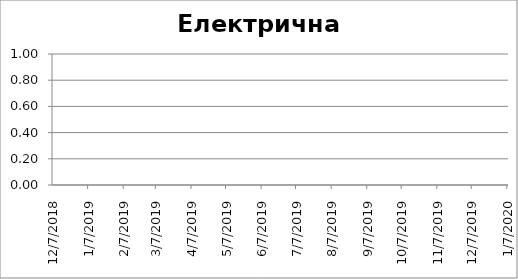
| Category | Електрична енергія |
|---|---|
| 12/7/18 | 0 |
| 12/13/18 | 0 |
| 12/19/18 | 0 |
| 12/25/18 | 0 |
| 12/31/18 | 0 |
| 1/6/19 | 0 |
| 1/12/19 | 0 |
| 1/18/19 | 0 |
| 1/24/19 | 0 |
| 1/30/19 | 0 |
| 2/5/19 | 0 |
| 2/11/19 | 0 |
| 2/17/19 | 0 |
| 2/23/19 | 0 |
| 3/1/19 | 0 |
| 3/7/19 | 0 |
| 3/13/19 | 0 |
| 3/19/19 | 0 |
| 3/25/19 | 0 |
| 3/31/19 | 0 |
| 4/6/19 | 0 |
| 4/12/19 | 0 |
| 4/18/19 | 0 |
| 4/24/19 | 0 |
| 4/30/19 | 0 |
| 5/6/19 | 0 |
| 5/12/19 | 0 |
| 5/18/19 | 0 |
| 5/24/19 | 0 |
| 5/30/19 | 0 |
| 6/5/19 | 0 |
| 6/11/19 | 0 |
| 6/17/19 | 0 |
| 6/23/19 | 0 |
| 6/29/19 | 0 |
| 7/5/19 | 0 |
| 7/11/19 | 0 |
| 7/17/19 | 0 |
| 7/23/19 | 0 |
| 7/29/19 | 0 |
| 8/4/19 | 0 |
| 8/10/19 | 0 |
| 8/16/19 | 0 |
| 8/22/19 | 0 |
| 8/28/19 | 0 |
| 9/3/19 | 0 |
| 9/9/19 | 0 |
| 9/15/19 | 0 |
| 9/21/19 | 0 |
| 9/27/19 | 0 |
| 10/3/19 | 0 |
| 10/9/19 | 0 |
| 10/15/19 | 0 |
| 10/21/19 | 0 |
| 10/27/19 | 0 |
| 11/2/19 | 0 |
| 11/8/19 | 0 |
| 11/14/19 | 0 |
| 11/20/19 | 0 |
| 11/26/19 | 0 |
| 12/2/19 | 0 |
| 12/8/19 | 0 |
| 12/14/19 | 0 |
| 12/20/19 | 0 |
| 12/26/19 | 0 |
| 1/1/20 | 0 |
| 1/7/20 | 0 |